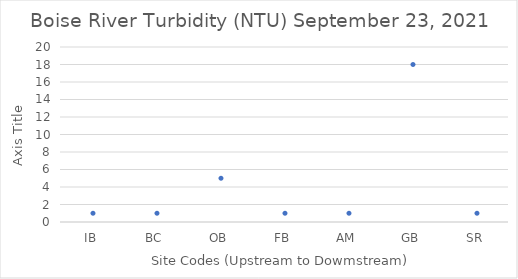
| Category | Turbidity (NTU) |
|---|---|
| IB | 1 |
| BC | 1 |
| OB | 5 |
| FB | 1 |
| AM | 1 |
| GB | 18 |
| SR | 1 |